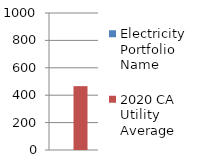
| Category | Electricity Portfolio Name | 2020 CA Utility Average |
|---|---|---|
| 0 | 0 | 466 |